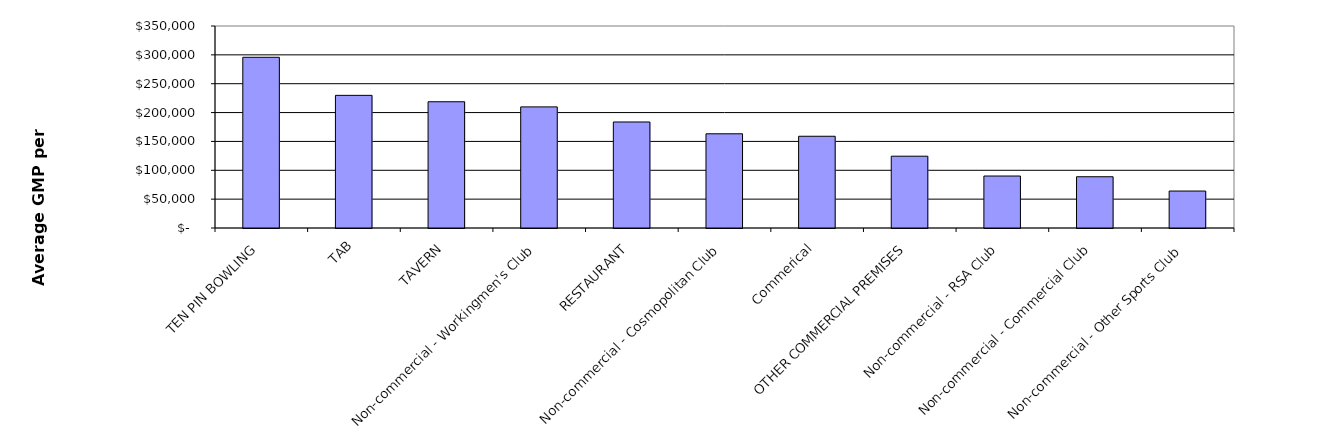
| Category | Series 0 |
|---|---|
| TEN PIN BOWLING | 295778.018 |
| TAB | 229844.901 |
| TAVERN | 218767.027 |
| Non-commercial - Workingmen's Club | 209869.766 |
| RESTAURANT | 183709.761 |
| Non-commercial - Cosmopolitan Club | 163237.515 |
| Commerical | 158971.847 |
| OTHER COMMERCIAL PREMISES | 124410.011 |
| Non-commercial - RSA Club | 90067.557 |
| Non-commercial - Commercial Club | 88818.519 |
| Non-commercial - Other Sports Club | 64053.582 |